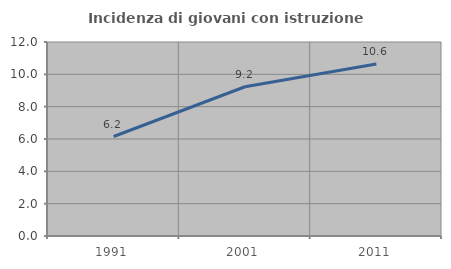
| Category | Incidenza di giovani con istruzione universitaria |
|---|---|
| 1991.0 | 6.154 |
| 2001.0 | 9.231 |
| 2011.0 | 10.638 |